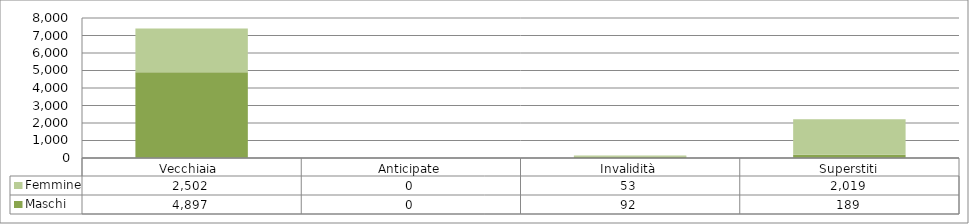
| Category | Maschi | Femmine |
|---|---|---|
| Vecchiaia  | 4897 | 2502 |
| Anticipate | 0 | 0 |
| Invalidità | 92 | 53 |
| Superstiti | 189 | 2019 |